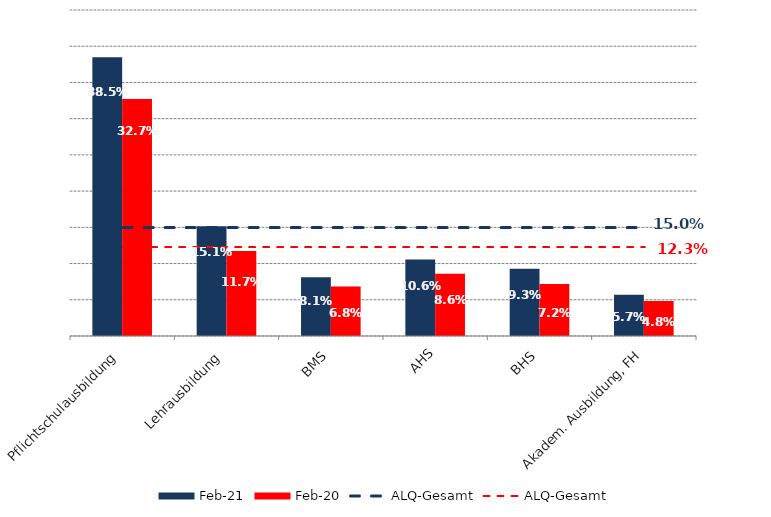
| Category | Feb 21 | Feb 20 |
|---|---|---|
| Pflichtschulausbildung | 0.385 | 0.327 |
| Lehrausbildung | 0.151 | 0.117 |
| BMS | 0.081 | 0.068 |
| AHS | 0.106 | 0.086 |
| BHS | 0.093 | 0.072 |
| Akadem. Ausbildung, FH | 0.057 | 0.048 |